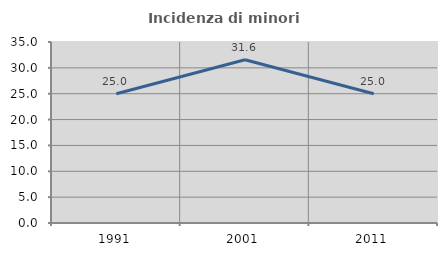
| Category | Incidenza di minori stranieri |
|---|---|
| 1991.0 | 25 |
| 2001.0 | 31.579 |
| 2011.0 | 25 |